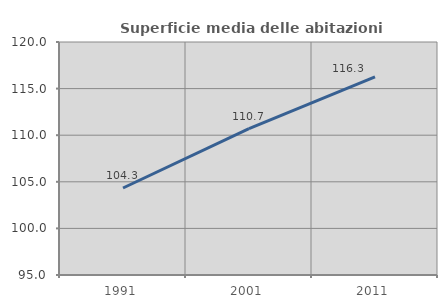
| Category | Superficie media delle abitazioni occupate |
|---|---|
| 1991.0 | 104.333 |
| 2001.0 | 110.698 |
| 2011.0 | 116.27 |